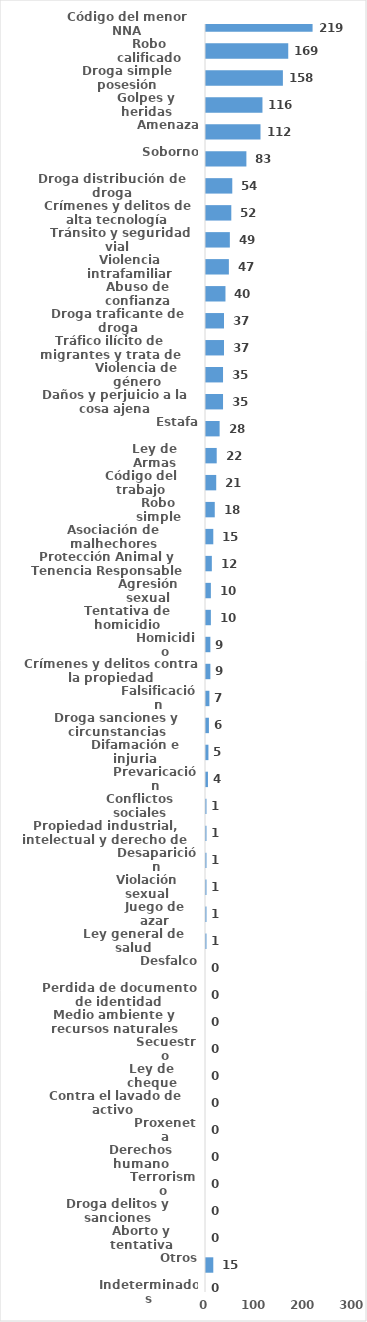
| Category | Series 0 |
|---|---|
| Código del menor NNA | 219 |
| Robo calificado | 169 |
| Droga simple posesión | 158 |
| Golpes y heridas | 116 |
| Amenaza | 112 |
| Soborno | 83 |
| Droga distribución de droga | 54 |
| Crímenes y delitos de alta tecnología | 52 |
| Tránsito y seguridad vial  | 49 |
| Violencia intrafamiliar | 47 |
| Abuso de confianza | 40 |
| Droga traficante de droga | 37 |
| Tráfico ilícito de migrantes y trata de personas | 37 |
| Violencia de género | 35 |
| Daños y perjuicio a la cosa ajena | 35 |
| Estafa | 28 |
| Ley de Armas | 22 |
| Código del trabajo | 21 |
| Robo simple | 18 |
| Asociación de malhechores | 15 |
| Protección Animal y Tenencia Responsable | 12 |
| Agresión sexual | 10 |
| Tentativa de homicidio | 10 |
| Homicidio | 9 |
| Crímenes y delitos contra la propiedad | 9 |
| Falsificación | 7 |
| Droga sanciones y circunstancias agravantes | 6 |
| Difamación e injuria | 5 |
| Prevaricación | 4 |
| Conflictos sociales | 1 |
| Propiedad industrial, intelectual y derecho de autor | 1 |
| Desaparición | 1 |
| Violación sexual | 1 |
| Juego de azar | 1 |
| Ley general de salud | 1 |
| Desfalco | 0 |
| Perdida de documento de identidad | 0 |
| Medio ambiente y recursos naturales | 0 |
| Secuestro | 0 |
| Ley de cheque | 0 |
| Contra el lavado de activo  | 0 |
| Proxeneta | 0 |
| Derechos humano | 0 |
| Terrorismo | 0 |
| Droga delitos y sanciones | 0 |
| Aborto y tentativa | 0 |
| Otros | 15 |
| Indeterminados | 0 |